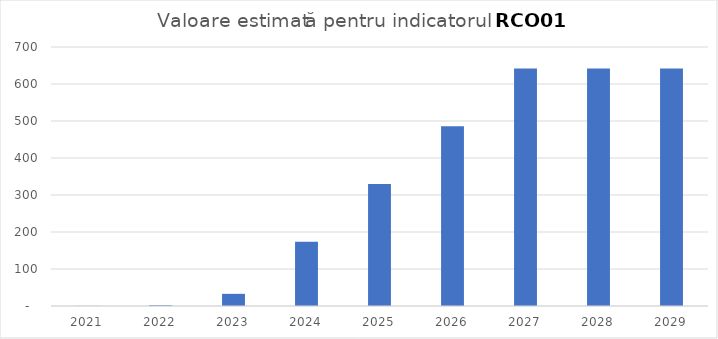
| Category | Series 0 |
|---|---|
| 2021.0 | 0.339 |
| 2022.0 | 2.033 |
| 2023.0 | 32.86 |
| 2024.0 | 173.449 |
| 2025.0 | 329.621 |
| 2026.0 | 485.792 |
| 2027.0 | 641.964 |
| 2028.0 | 641.964 |
| 2029.0 | 641.964 |